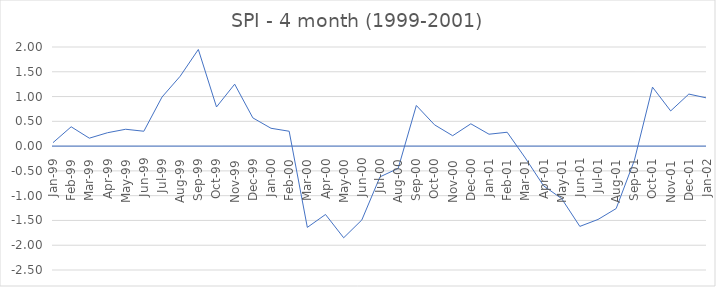
| Category | SPI - 4 month |
|---|---|
| Jan-99 | 0.07 |
| Feb-99 | 0.39 |
| Mar-99 | 0.16 |
| Apr-99 | 0.27 |
| May-99 | 0.34 |
| Jun-99 | 0.3 |
| Jul-99 | 0.99 |
| Aug-99 | 1.41 |
| Sep-99 | 1.95 |
| Oct-99 | 0.79 |
| Nov-99 | 1.25 |
| Dec-99 | 0.57 |
| Jan-00 | 0.36 |
| Feb-00 | 0.3 |
| Mar-00 | -1.64 |
| Apr-00 | -1.38 |
| May-00 | -1.85 |
| Jun-00 | -1.49 |
| Jul-00 | -0.62 |
| Aug-00 | -0.45 |
| Sep-00 | 0.82 |
| Oct-00 | 0.43 |
| Nov-00 | 0.21 |
| Dec-00 | 0.45 |
| Jan-01 | 0.24 |
| Feb-01 | 0.28 |
| Mar-01 | -0.24 |
| Apr-01 | -0.8 |
| May-01 | -1.06 |
| Jun-01 | -1.62 |
| Jul-01 | -1.48 |
| Aug-01 | -1.26 |
| Sep-01 | -0.29 |
| Oct-01 | 1.19 |
| Nov-01 | 0.71 |
| Dec-01 | 1.05 |
| Jan-02 | 0.97 |